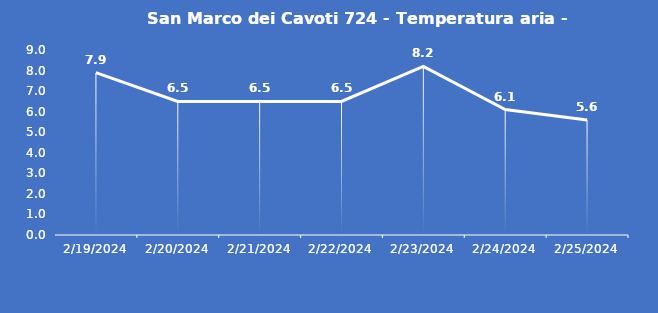
| Category | San Marco dei Cavoti 724 - Temperatura aria - Grezzo (°C) |
|---|---|
| 2/19/24 | 7.9 |
| 2/20/24 | 6.5 |
| 2/21/24 | 6.5 |
| 2/22/24 | 6.5 |
| 2/23/24 | 8.2 |
| 2/24/24 | 6.1 |
| 2/25/24 | 5.6 |